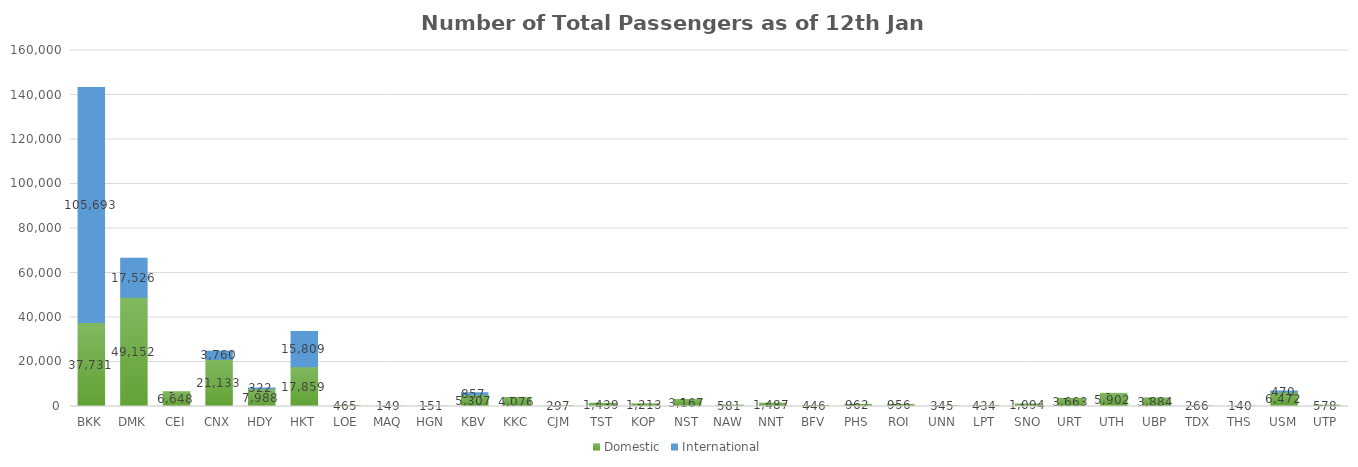
| Category | Domestic | International |
|---|---|---|
| BKK | 37731 | 105693 |
| DMK | 49152 | 17526 |
| CEI | 6648 | 0 |
| CNX | 21133 | 3760 |
| HDY | 7988 | 322 |
| HKT | 17859 | 15809 |
| LOE | 465 | 0 |
| MAQ | 149 | 0 |
| HGN | 151 | 0 |
| KBV | 5307 | 857 |
| KKC | 4076 | 0 |
| CJM | 297 | 0 |
| TST | 1439 | 0 |
| KOP | 1213 | 0 |
| NST | 3167 | 0 |
| NAW | 581 | 0 |
| NNT | 1487 | 0 |
| BFV | 446 | 0 |
| PHS | 962 | 0 |
| ROI | 956 | 0 |
| UNN | 345 | 0 |
| LPT | 434 | 0 |
| SNO | 1094 | 0 |
| URT | 3663 | 0 |
| UTH | 5902 | 0 |
| UBP | 3884 | 0 |
| TDX | 266 | 0 |
| THS | 140 | 0 |
| USM | 6472 | 470 |
| UTP | 578 | 0 |